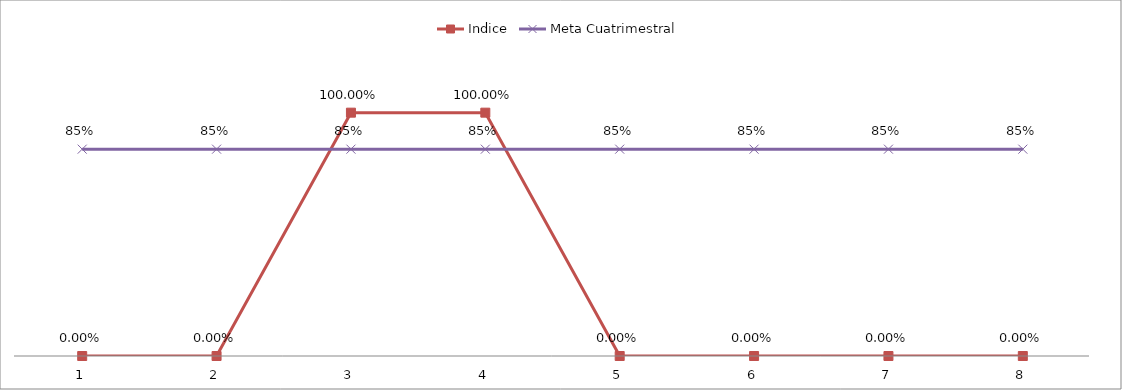
| Category | Indice | Meta Cuatrimestral |
|---|---|---|
| 0 | 0 | 0.85 |
| 1 | 0 | 0.85 |
| 2 | 1 | 0.85 |
| 3 | 1 | 0.85 |
| 4 | 0 | 0.85 |
| 5 | 0 | 0.85 |
| 6 | 0 | 0.85 |
| 7 | 0 | 0.85 |